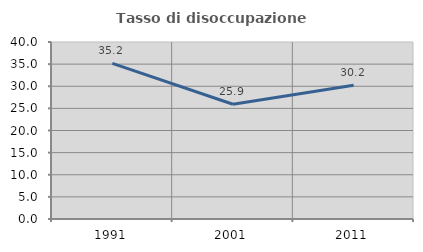
| Category | Tasso di disoccupazione giovanile  |
|---|---|
| 1991.0 | 35.185 |
| 2001.0 | 25.926 |
| 2011.0 | 30.233 |